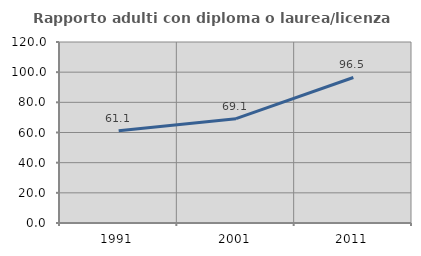
| Category | Rapporto adulti con diploma o laurea/licenza media  |
|---|---|
| 1991.0 | 61.111 |
| 2001.0 | 69.149 |
| 2011.0 | 96.479 |